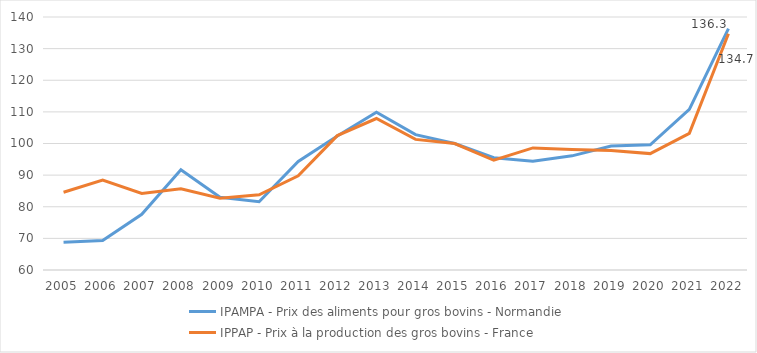
| Category | IPAMPA - Prix des aliments pour gros bovins - Normandie | IPPAP - Prix à la production des gros bovins - France |
|---|---|---|
| 2005.0 | 68.8 | 84.6 |
| 2006.0 | 69.3 | 88.4 |
| 2007.0 | 77.6 | 84.2 |
| 2008.0 | 91.7 | 85.7 |
| 2009.0 | 83 | 82.7 |
| 2010.0 | 81.6 | 83.8 |
| 2011.0 | 94.3 | 89.8 |
| 2012.0 | 102.4 | 102.5 |
| 2013.0 | 109.9 | 107.9 |
| 2014.0 | 102.8 | 101.3 |
| 2015.0 | 100 | 100 |
| 2016.0 | 95.5 | 94.7 |
| 2017.0 | 94.4 | 98.6 |
| 2018.0 | 96.1 | 98.1 |
| 2019.0 | 99.2 | 97.8 |
| 2020.0 | 99.6 | 96.8 |
| 2021.0 | 110.8 | 103.2 |
| 2022.0 | 136.3 | 134.7 |